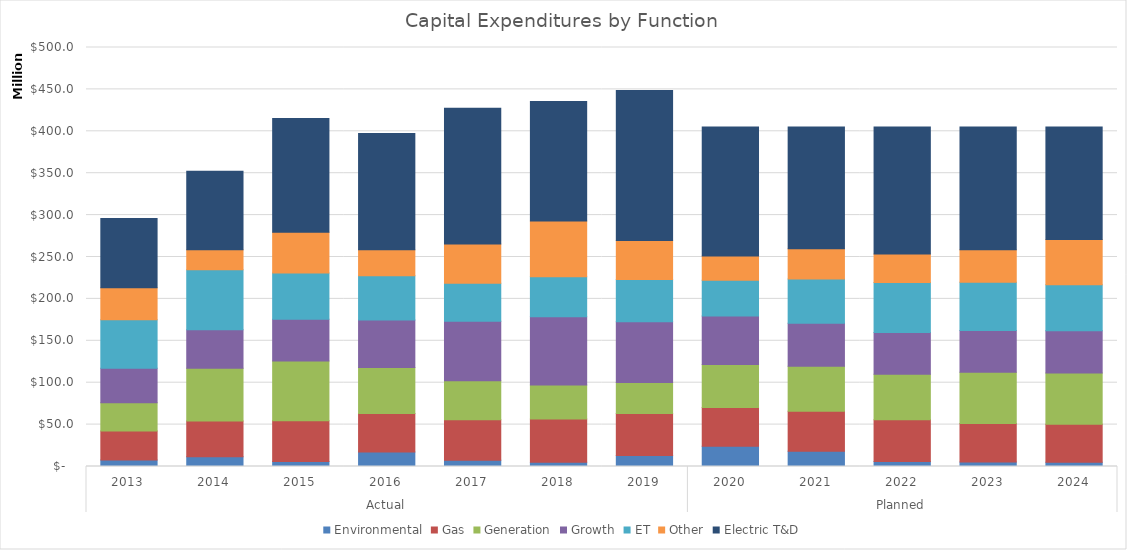
| Category | Environmental | Gas | Generation | Growth | ET | Other | Electric T&D |
|---|---|---|---|---|---|---|---|
| 0 | 7800100.36 | 34693403.02 | 33617318.36 | 41102731.74 | 58001734.14 | 38025094.39 | 82623247.64 |
| 1 | 11740365 | 42597966 | 62764658 | 46157518 | 71378734 | 24084898 | 93552939 |
| 2 | 6000000 | 48600000 | 71400000 | 49800000 | 55000000 | 48700000 | 135800000 |
| 3 | 17312000 | 45859000 | 55067000 | 56694000 | 52697000 | 31043000 | 138716000 |
| 4 | 7446000 | 48472000 | 46482000 | 70926000 | 45394000 | 46735000 | 162094000 |
| 5 | 4967000 | 51730000 | 40494000 | 81415000 | 47927000 | 66408000 | 142640000 |
| 6 | 12996098 | 50170847 | 37052298 | 72424179 | 50575041 | 46428499 | 179160901 |
| 7 | 24136627 | 46193892 | 51451805 | 57956711 | 42594463 | 28942845 | 153723657 |
| 8 | 18223068 | 47608892 | 53933675 | 51134379 | 52905275 | 36023346 | 145171365 |
| 9 | 6096910 | 49549816 | 54488738 | 49859819 | 59687121 | 33761476 | 151556120 |
| 10 | 5282698 | 45988645 | 61201000 | 49734401 | 57584578 | 38885258 | 146323420 |
| 11 | 5094679 | 45355648 | 61199000 | 50362596 | 54836578 | 53946179 | 134205320 |